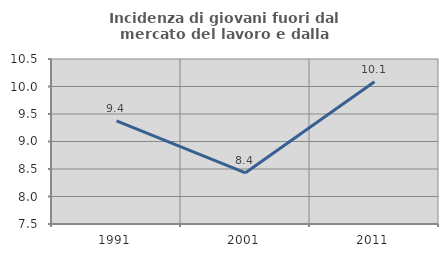
| Category | Incidenza di giovani fuori dal mercato del lavoro e dalla formazione  |
|---|---|
| 1991.0 | 9.375 |
| 2001.0 | 8.43 |
| 2011.0 | 10.087 |